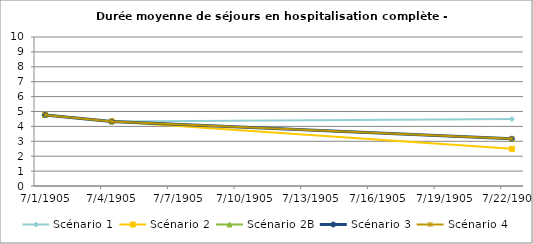
| Category | Scénario 1 | Scénario 2 | Scénario 2B | Scénario 3 | Scénario 4 |
|---|---|---|---|---|---|
| 2009.0 | 4.772 | 4.772 | 4.772 | 4.772 | 4.772 |
| 2012.0 | 4.335 | 4.335 | 4.335 | 4.335 | 4.335 |
| 2030.0 | 4.491 | 2.493 | 3.172 | 3.172 | 3.172 |